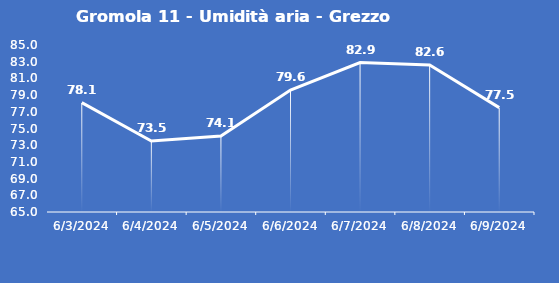
| Category | Gromola 11 - Umidità aria - Grezzo (%) |
|---|---|
| 6/3/24 | 78.1 |
| 6/4/24 | 73.5 |
| 6/5/24 | 74.1 |
| 6/6/24 | 79.6 |
| 6/7/24 | 82.9 |
| 6/8/24 | 82.6 |
| 6/9/24 | 77.5 |